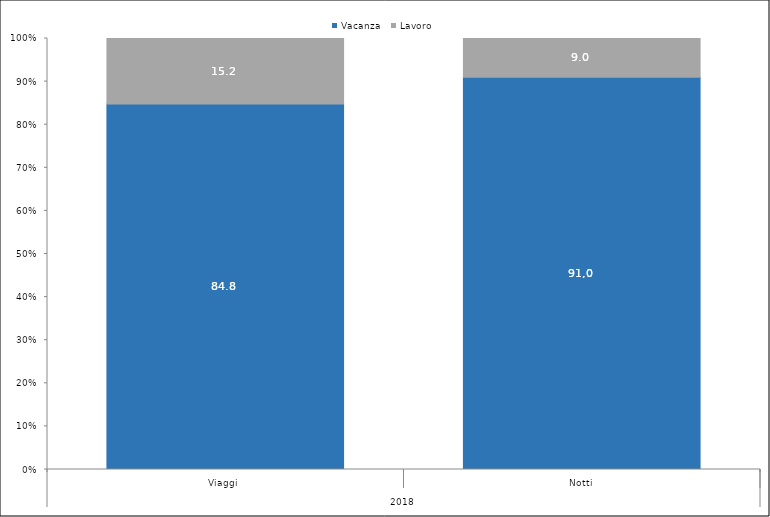
| Category | Vacanza | Lavoro |
|---|---|---|
| 0 | 84.8 | 15.2 |
| 1 | 91 | 9 |